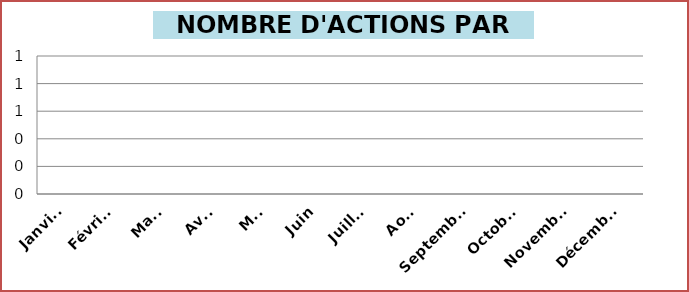
| Category | Series 0 |
|---|---|
| Janvier | 0 |
| Février | 0 |
| Mars | 0 |
| Avril | 0 |
| Mai | 0 |
| Juin | 0 |
| Juillet | 0 |
| Août | 0 |
| Septembre | 0 |
| Octobre | 0 |
| Novembre | 0 |
| Décembre | 0 |